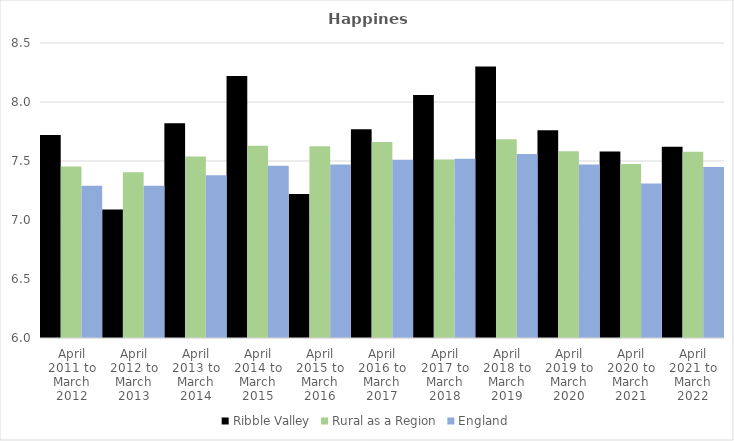
| Category | Ribble Valley | Rural as a Region | England |
|---|---|---|---|
| April 2011 to March 2012 | 7.72 | 7.454 | 7.29 |
| April 2012 to March 2013 | 7.09 | 7.406 | 7.29 |
| April 2013 to March 2014 | 7.82 | 7.539 | 7.38 |
| April 2014 to March 2015 | 8.22 | 7.63 | 7.46 |
| April 2015 to March 2016 | 7.22 | 7.625 | 7.47 |
| April 2016 to March 2017 | 7.77 | 7.661 | 7.51 |
| April 2017 to March 2018 | 8.06 | 7.513 | 7.52 |
| April 2018 to March 2019 | 8.3 | 7.684 | 7.56 |
| April 2019 to March 2020 | 7.76 | 7.582 | 7.47 |
| April 2020 to March 2021 | 7.58 | 7.474 | 7.31 |
| April 2021 to March 2022 | 7.62 | 7.577 | 7.45 |